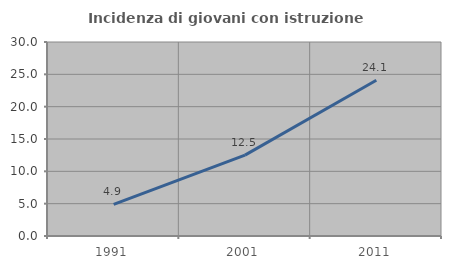
| Category | Incidenza di giovani con istruzione universitaria |
|---|---|
| 1991.0 | 4.878 |
| 2001.0 | 12.5 |
| 2011.0 | 24.074 |